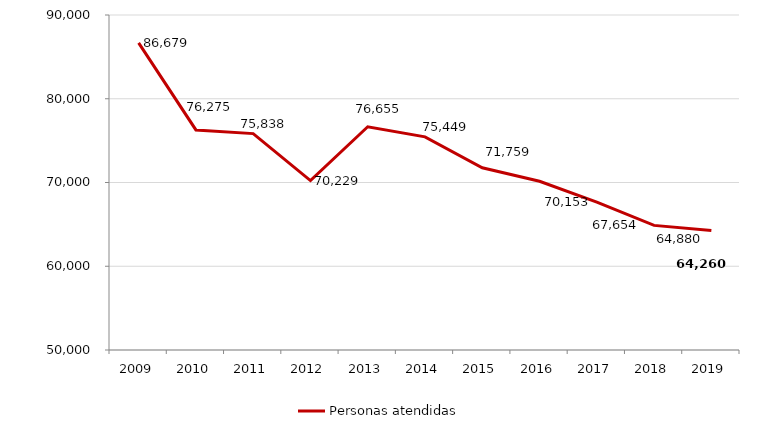
| Category | Personas atendidas |
|---|---|
| 2009.0 | 86679 |
| 2010.0 | 76275 |
| 2011.0 | 75838 |
| 2012.0 | 70229 |
| 2013.0 | 76655 |
| 2014.0 | 75449 |
| 2015.0 | 71759 |
| 2016.0 | 70153 |
| 2017.0 | 67654 |
| 2018.0 | 64880 |
| 2019.0 | 64260 |